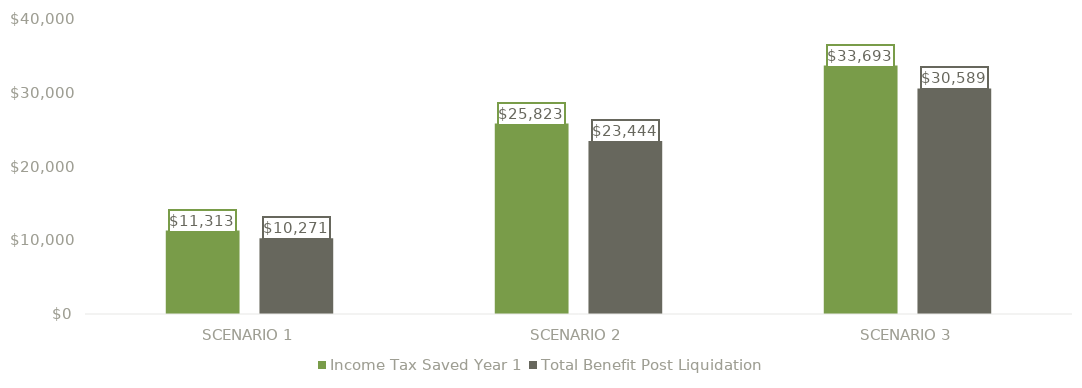
| Category | Income Tax Saved Year 1 | Total Benefit Post Liquidation |
|---|---|---|
| SCENARIO 1 | 11313.125 | 10270.857 |
| SCENARIO 2 | 25823.438 | 23444.348 |
| SCENARIO 3 | 33693.438 | 30589.292 |